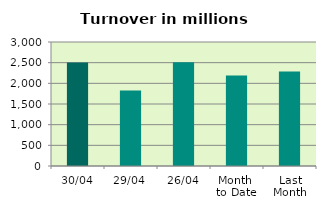
| Category | Series 0 |
|---|---|
| 30/04 | 2505.365 |
| 29/04 | 1827.663 |
| 26/04 | 2508.775 |
| Month 
to Date | 2186.926 |
| Last
Month | 2286.259 |